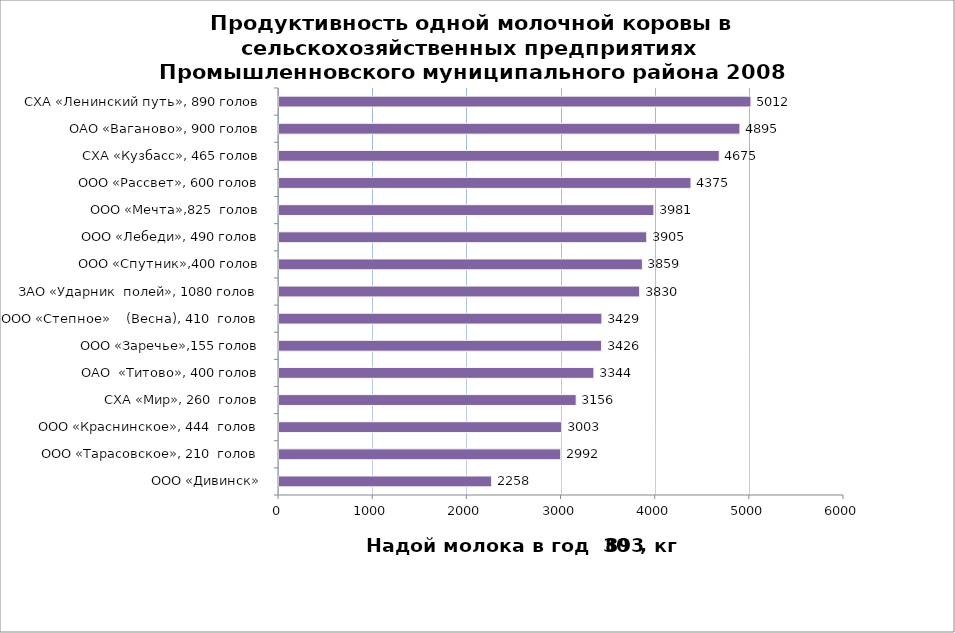
| Category | Series 0 |
|---|---|
| ООО «Дивинск» | 2258 |
| ООО «Тарасовское», 210  голов | 2992 |
| ООО «Краснинское», 444  голов | 3003 |
| СХА «Мир», 260  голов | 3156 |
| ОАО  «Титово», 400 голов | 3344 |
| ООО «Заречье»,155 голов | 3426 |
| ООО «Степное»    (Весна), 410  голов | 3429 |
| ЗАО «Ударник  полей», 1080 голов | 3830 |
| ООО «Спутник»,400 голов | 3859 |
| ООО «Лебеди», 490 голов | 3905 |
| ООО «Мечта»,825  голов | 3981 |
| ООО «Рассвет», 600 голов | 4375 |
| СХА «Кузбасс», 465 голов | 4675 |
| ОАО «Ваганово», 900 голов | 4895 |
| СХА «Ленинский путь», 890 голов | 5012 |